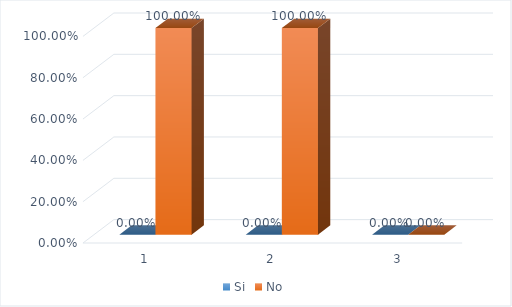
| Category | Si | No |
|---|---|---|
| 0 | 0 | 1 |
| 1 | 0 | 1 |
| 2 | 0 | 0 |